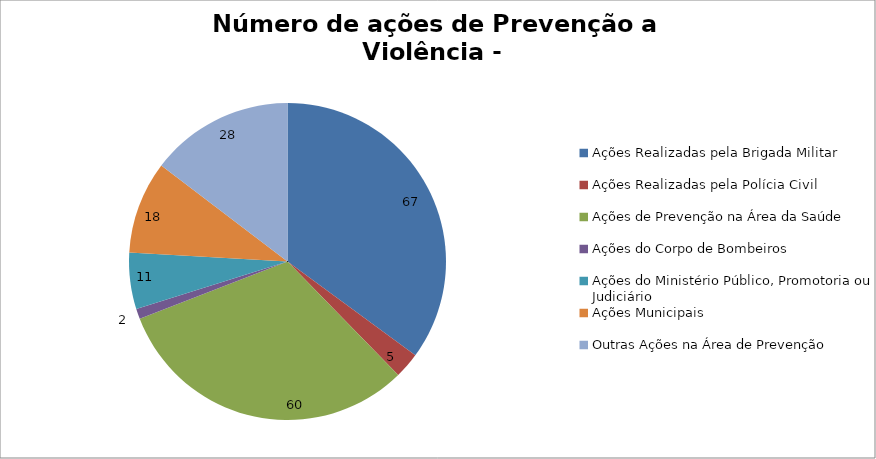
| Category | Número de Ações |
|---|---|
| Ações Realizadas pela Brigada Militar | 67 |
| Ações Realizadas pela Polícia Civil | 5 |
| Ações de Prevenção na Área da Saúde | 60 |
| Ações do Corpo de Bombeiros | 2 |
| Ações do Ministério Público, Promotoria ou Judiciário | 11 |
| Ações Municipais | 18 |
| Outras Ações na Área de Prevenção | 28 |